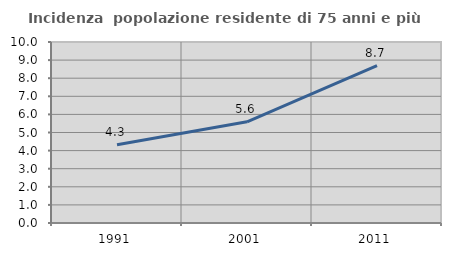
| Category | Incidenza  popolazione residente di 75 anni e più |
|---|---|
| 1991.0 | 4.322 |
| 2001.0 | 5.592 |
| 2011.0 | 8.699 |